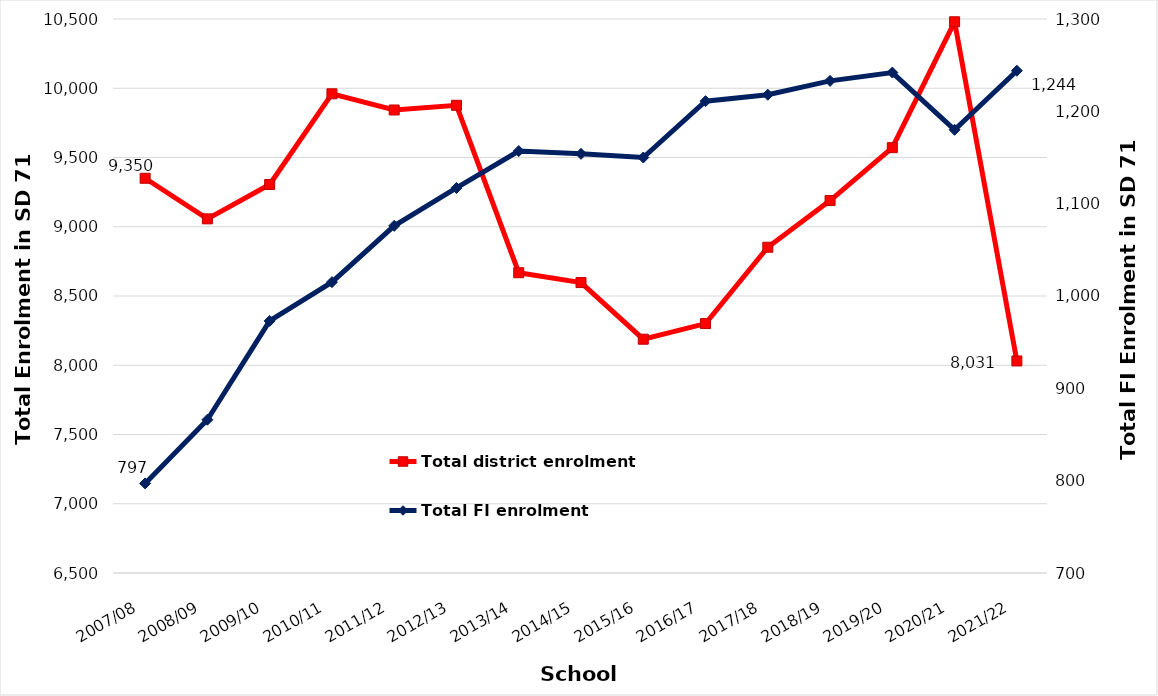
| Category | Total district enrolment  |
|---|---|
| 2007/08 | 9350 |
| 2008/09 | 9057 |
| 2009/10 | 9305 |
| 2010/11 | 9960 |
| 2011/12 | 9843 |
| 2012/13 | 9877 |
| 2013/14 | 8668 |
| 2014/15 | 8597 |
| 2015/16 | 8188 |
| 2016/17 | 8301 |
| 2017/18 | 8852 |
| 2018/19 | 9189 |
| 2019/20 | 9571 |
| 2020/21 | 10480 |
| 2021/22 | 8031 |